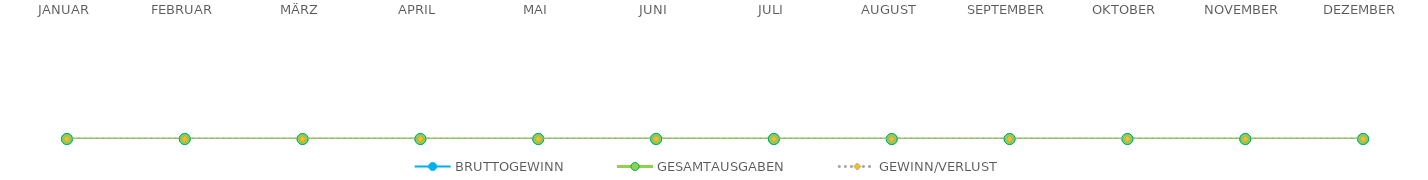
| Category | BRUTTOGEWINN | GESAMTAUSGABEN | GEWINN/VERLUST |
|---|---|---|---|
| JANUAR | 0 | 0 | 0 |
| FEBRUAR | 0 | 0 | 0 |
| MÄRZ | 0 | 0 | 0 |
| APRIL | 0 | 0 | 0 |
| MAI | 0 | 0 | 0 |
| JUNI | 0 | 0 | 0 |
| JULI | 0 | 0 | 0 |
| AUGUST | 0 | 0 | 0 |
| SEPTEMBER | 0 | 0 | 0 |
| OKTOBER | 0 | 0 | 0 |
| NOVEMBER | 0 | 0 | 0 |
| DEZEMBER | 0 | 0 | 0 |